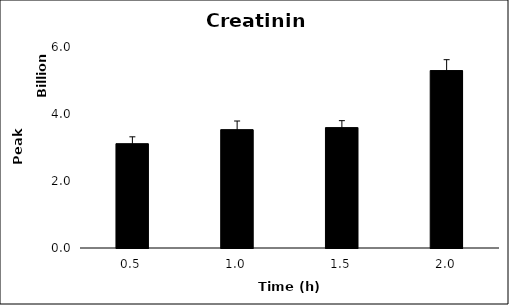
| Category | Series 0 |
|---|---|
| 0.5 | 3113882539.333 |
| 1.0 | 3533281731 |
| 1.5 | 3593408253 |
| 2.0 | 5296850928.667 |